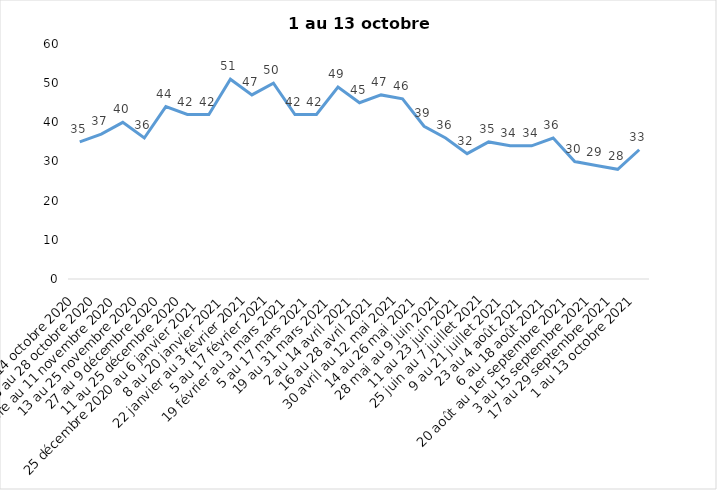
| Category | Toujours aux trois mesures |
|---|---|
| 2 au 14 octobre 2020 | 35 |
| 16 au 28 octobre 2020 | 37 |
| 30 octobre au 11 novembre 2020 | 40 |
| 13 au 25 novembre 2020 | 36 |
| 27 au 9 décembre 2020 | 44 |
| 11 au 25 décembre 2020 | 42 |
| 25 décembre 2020 au 6 janvier 2021 | 42 |
| 8 au 20 janvier 2021 | 51 |
| 22 janvier au 3 février 2021 | 47 |
| 5 au 17 février 2021 | 50 |
| 19 février au 3 mars 2021 | 42 |
| 5 au 17 mars 2021 | 42 |
| 19 au 31 mars 2021 | 49 |
| 2 au 14 avril 2021 | 45 |
| 16 au 28 avril 2021 | 47 |
| 30 avril au 12 mai 2021 | 46 |
| 14 au 26 mai 2021 | 39 |
| 28 mai au 9 juin 2021 | 36 |
| 11 au 23 juin 2021 | 32 |
| 25 juin au 7 juillet 2021 | 35 |
| 9 au 21 juillet 2021 | 34 |
| 23 au 4 août 2021 | 34 |
| 6 au 18 août 2021 | 36 |
| 20 août au 1er septembre 2021 | 30 |
| 3 au 15 septembre 2021 | 29 |
| 17 au 29 septembre 2021 | 28 |
| 1 au 13 octobre 2021 | 33 |